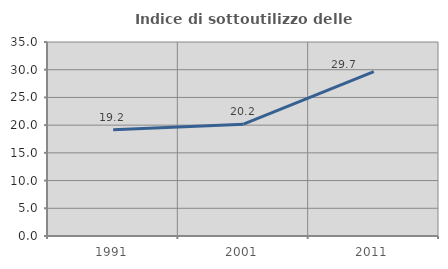
| Category | Indice di sottoutilizzo delle abitazioni  |
|---|---|
| 1991.0 | 19.19 |
| 2001.0 | 20.178 |
| 2011.0 | 29.651 |